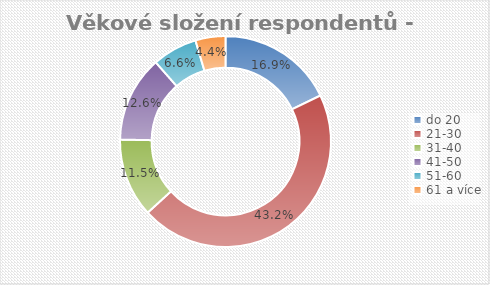
| Category | Series 0 |
|---|---|
| do 20 | 0.169 |
| 21-30 | 0.432 |
| 31-40 | 0.115 |
| 41-50 | 0.126 |
| 51-60 | 0.066 |
| 61 a více | 0.044 |